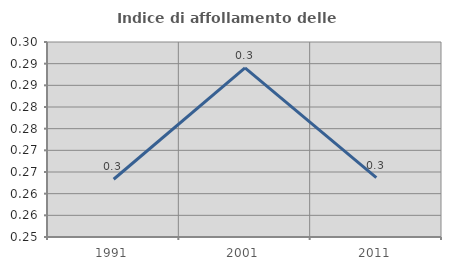
| Category | Indice di affollamento delle abitazioni  |
|---|---|
| 1991.0 | 0.263 |
| 2001.0 | 0.289 |
| 2011.0 | 0.264 |